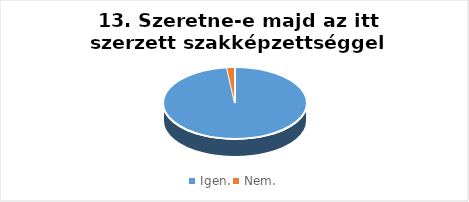
| Category | Series 0 |
|---|---|
| Igen. | 98.21 |
| Nem. | 1.79 |